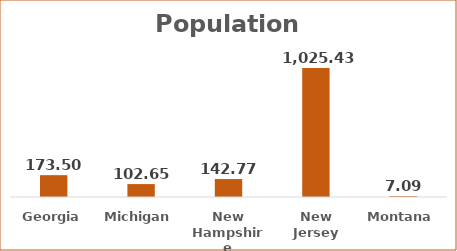
| Category | Population Density  |
|---|---|
| Georgia | 173.5 |
| Michigan | 102.65 |
| New Hampshire | 142.77 |
| New Jersey | 1025.43 |
| Montana | 7.09 |